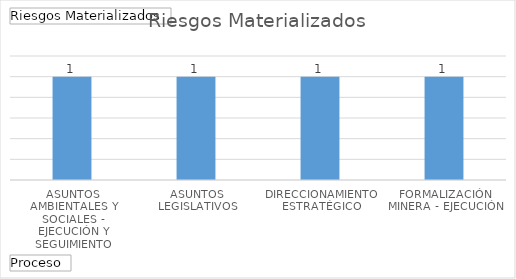
| Category | Total |
|---|---|
| ASUNTOS AMBIENTALES Y SOCIALES - EJECUCIÓN Y SEGUIMIENTO | 1 |
| ASUNTOS LEGISLATIVOS | 1 |
| DIRECCIONAMIENTO ESTRATÉGICO | 1 |
| FORMALIZACIÓN MINERA - EJECUCIÓN | 1 |